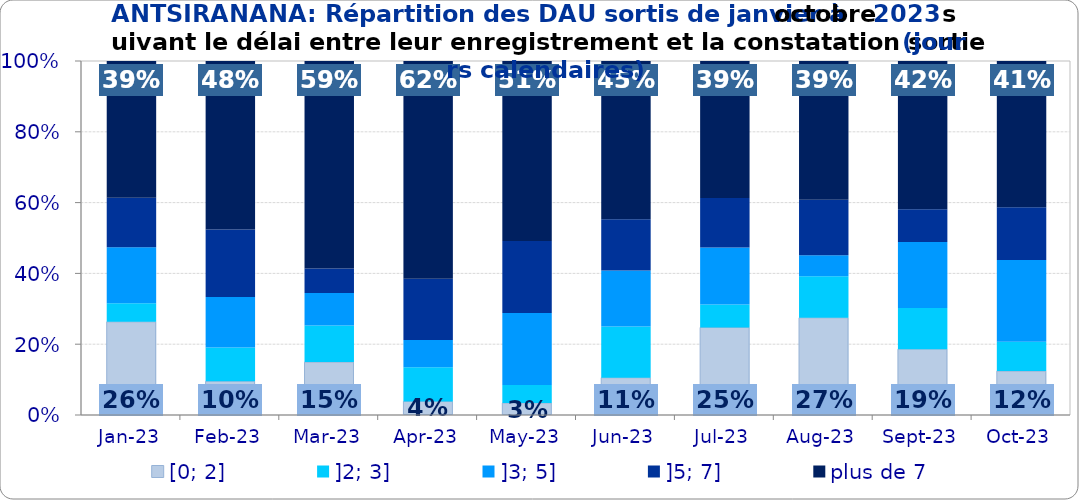
| Category | [0; 2] | ]2; 3] | ]3; 5] | ]5; 7] | plus de 7 |
|---|---|---|---|---|---|
| 2023-01-01 | 0.263 | 0.053 | 0.158 | 0.14 | 0.386 |
| 2023-02-01 | 0.095 | 0.095 | 0.143 | 0.19 | 0.476 |
| 2023-03-01 | 0.149 | 0.103 | 0.092 | 0.069 | 0.586 |
| 2023-04-01 | 0.038 | 0.096 | 0.077 | 0.173 | 0.615 |
| 2023-05-01 | 0.034 | 0.051 | 0.203 | 0.203 | 0.508 |
| 2023-06-01 | 0.105 | 0.145 | 0.158 | 0.145 | 0.447 |
| 2023-07-01 | 0.247 | 0.065 | 0.161 | 0.14 | 0.387 |
| 2023-08-01 | 0.275 | 0.118 | 0.059 | 0.157 | 0.392 |
| 2023-09-01 | 0.186 | 0.116 | 0.186 | 0.093 | 0.419 |
| 2023-10-01 | 0.124 | 0.083 | 0.231 | 0.149 | 0.413 |